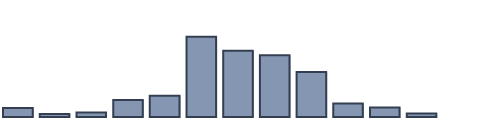
| Category | Series 0 |
|---|---|
| 0 | 2.681 |
| 1 | 0.916 |
| 2 | 1.365 |
| 3 | 5.06 |
| 4 | 6.323 |
| 5 | 23.971 |
| 6 | 19.811 |
| 7 | 18.465 |
| 8 | 13.438 |
| 9 | 4.051 |
| 10 | 2.845 |
| 11 | 1.075 |
| 12 | 0 |